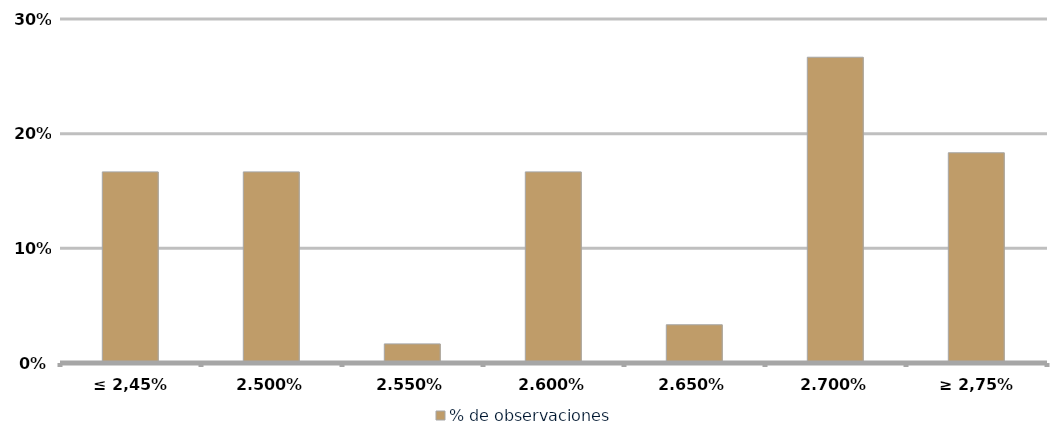
| Category | % de observaciones  |
|---|---|
| ≤ 2,45% | 0.167 |
| 2.50% | 0.167 |
| 2.55% | 0.017 |
| 2.60% | 0.167 |
| 2.65% | 0.033 |
| 2.70% | 0.267 |
| ≥ 2,75% | 0.183 |